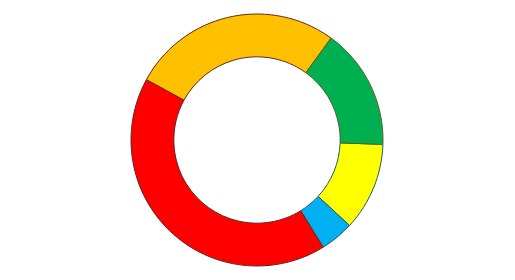
| Category | Series 0 |
|---|---|
| Medicare | 123 |
| Other Mandatory | 47 |
| Defense Discretionary | 454 |
| Non-Defense Discretionary | 294 |
| Interest | 169 |